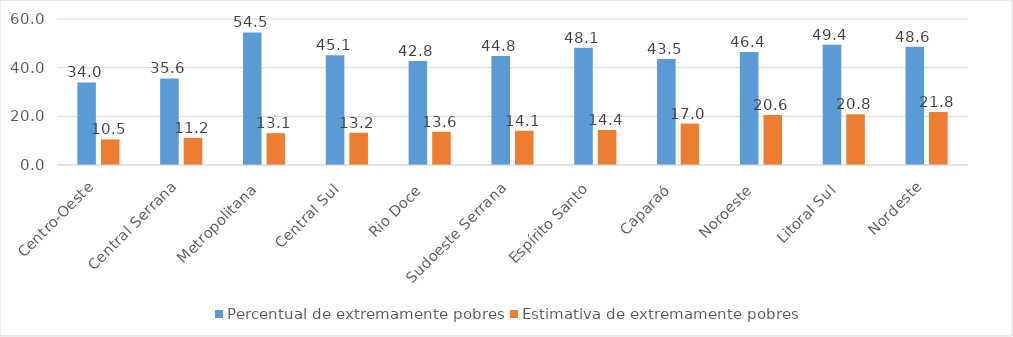
| Category | Percentual de extremamente pobres | Estimativa de extremamente pobres |
|---|---|---|
| Centro-Oeste | 33.952 | 10.521 |
|  Central Serrana  | 35.597 | 11.155 |
|  Metropolitana  | 54.486 | 13.067 |
|  Central Sul  | 45.094 | 13.244 |
|  Rio Doce  | 42.755 | 13.634 |
|  Sudoeste Serrana  | 44.78 | 14.068 |
|  Espírito Santo  | 48.145 | 14.412 |
|  Caparaó  | 43.515 | 17.026 |
|  Noroeste  | 46.429 | 20.577 |
|  Litoral Sul  | 49.436 | 20.834 |
|  Nordeste  | 48.586 | 21.788 |